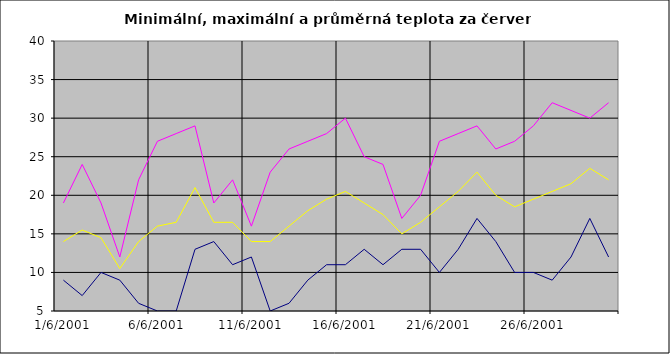
| Category | Series 0 | Series 1 | Series 2 |
|---|---|---|---|
| 2001-06-01 | 9 | 19 | 14 |
| 2001-06-02 | 7 | 24 | 15.5 |
| 2001-06-03 | 10 | 19 | 14.5 |
| 2001-06-04 | 9 | 12 | 10.5 |
| 2001-06-05 | 6 | 22 | 14 |
| 2001-06-06 | 5 | 27 | 16 |
| 2001-06-07 | 5 | 28 | 16.5 |
| 2001-06-08 | 13 | 29 | 21 |
| 2001-06-09 | 14 | 19 | 16.5 |
| 2001-06-10 | 11 | 22 | 16.5 |
| 2001-06-11 | 12 | 16 | 14 |
| 2001-06-12 | 5 | 23 | 14 |
| 2001-06-13 | 6 | 26 | 16 |
| 2001-06-14 | 9 | 27 | 18 |
| 2001-06-15 | 11 | 28 | 19.5 |
| 2001-06-16 | 11 | 30 | 20.5 |
| 2001-06-17 | 13 | 25 | 19 |
| 2001-06-18 | 11 | 24 | 17.5 |
| 2001-06-19 | 13 | 17 | 15 |
| 2001-06-20 | 13 | 20 | 16.5 |
| 2001-06-21 | 10 | 27 | 18.5 |
| 2001-06-22 | 13 | 28 | 20.5 |
| 2001-06-23 | 17 | 29 | 23 |
| 2001-06-24 | 14 | 26 | 20 |
| 2001-06-25 | 10 | 27 | 18.5 |
| 2001-06-26 | 10 | 29 | 19.5 |
| 2001-06-27 | 9 | 32 | 20.5 |
| 2001-06-28 | 12 | 31 | 21.5 |
| 2001-06-29 | 17 | 30 | 23.5 |
| 2001-06-30 | 12 | 32 | 22 |